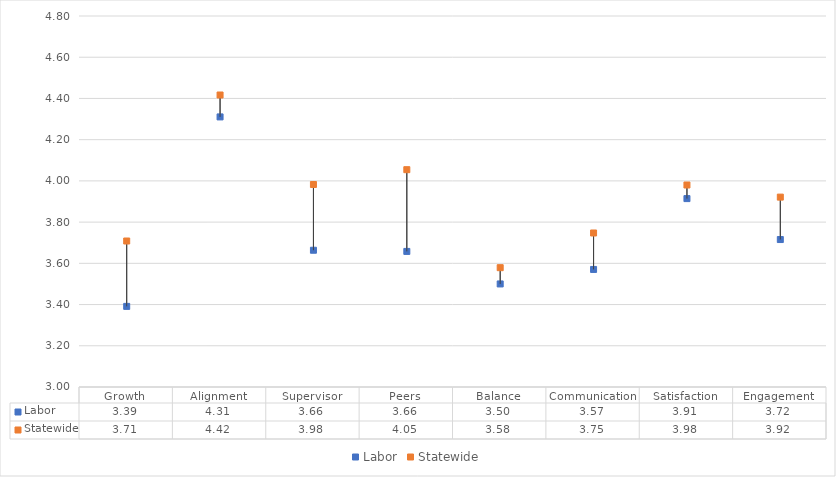
| Category | Labor | Statewide |
|---|---|---|
| Growth | 3.391 | 3.708 |
| Alignment | 4.31 | 4.417 |
| Supervisor | 3.664 | 3.983 |
| Peers | 3.658 | 4.054 |
| Balance | 3.5 | 3.579 |
| Communication | 3.57 | 3.747 |
| Satisfaction | 3.914 | 3.98 |
| Engagement | 3.715 | 3.921 |